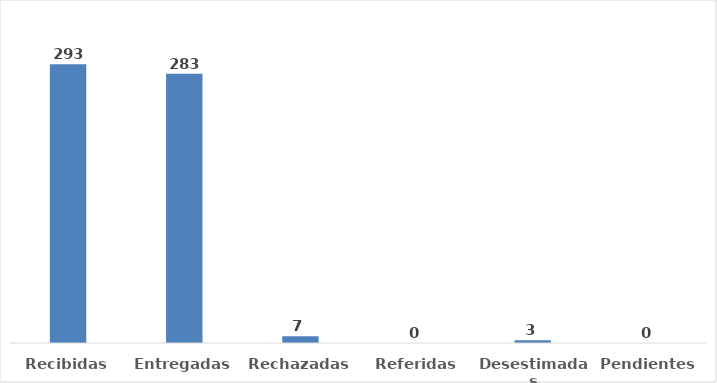
| Category | Series 0 |
|---|---|
| Recibidas | 293 |
| Entregadas | 283 |
| Rechazadas | 7 |
| Referidas | 0 |
| Desestimadas | 3 |
| Pendientes | 0 |